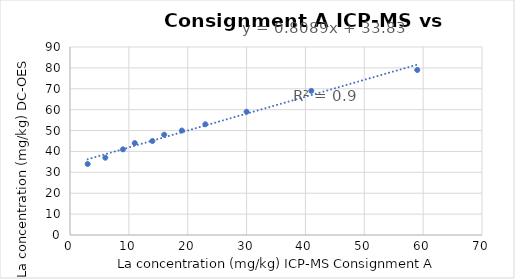
| Category | DC-OES La (mg/kg) |
|---|---|
| 3.0 | 34 |
| 6.0 | 37 |
| 9.0 | 41 |
| 11.0 | 44 |
| 14.0 | 45 |
| 16.0 | 48 |
| 19.0 | 50 |
| 23.0 | 53 |
| 30.0 | 59 |
| 41.0 | 69 |
| 59.0 | 79 |